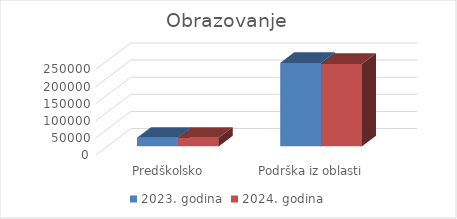
| Category | 2023. godina | 2024. godina |
|---|---|---|
| Predškolsko obrazovanje | 25000 | 25000 |
| Podrška iz oblasti obrazovanja | 243780 | 240901 |